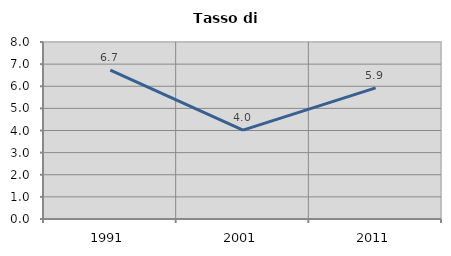
| Category | Tasso di disoccupazione   |
|---|---|
| 1991.0 | 6.733 |
| 2001.0 | 4.019 |
| 2011.0 | 5.926 |